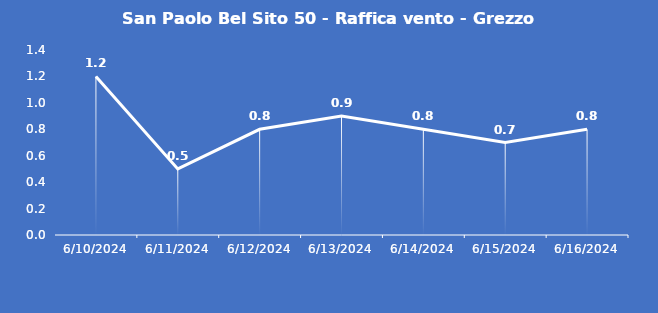
| Category | San Paolo Bel Sito 50 - Raffica vento - Grezzo (m/s) |
|---|---|
| 6/10/24 | 1.2 |
| 6/11/24 | 0.5 |
| 6/12/24 | 0.8 |
| 6/13/24 | 0.9 |
| 6/14/24 | 0.8 |
| 6/15/24 | 0.7 |
| 6/16/24 | 0.8 |